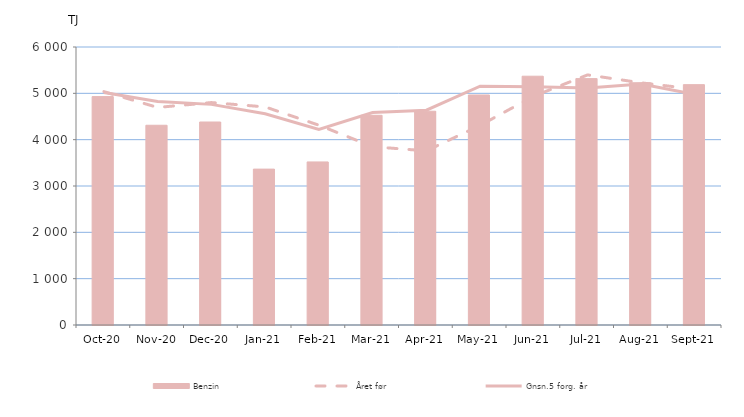
| Category | Benzin |
|---|---|
| 2020-10-01 | 4929.405 |
| 2020-11-01 | 4310.84 |
| 2020-12-01 | 4381.172 |
| 2021-01-01 | 3364.53 |
| 2021-02-01 | 3519.615 |
| 2021-03-01 | 4525.646 |
| 2021-04-01 | 4613.684 |
| 2021-05-01 | 4964.785 |
| 2021-06-01 | 5369.562 |
| 2021-07-01 | 5317.561 |
| 2021-08-01 | 5228.11 |
| 2021-09-01 | 5187.475 |